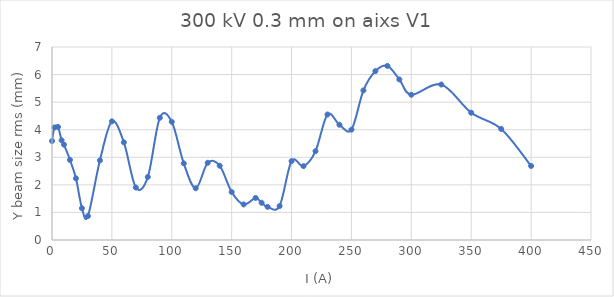
| Category | Series 0 |
|---|---|
| 0.0 | 3.59 |
| 2.0 | 4.081 |
| 5.0 | 4.099 |
| 8.0 | 3.616 |
| 10.0 | 3.458 |
| 15.0 | 2.904 |
| 20.0 | 2.235 |
| 25.0 | 1.153 |
| 30.0 | 0.869 |
| 40.0 | 2.887 |
| 50.0 | 4.302 |
| 60.0 | 3.543 |
| 70.0 | 1.904 |
| 80.0 | 2.285 |
| 90.0 | 4.43 |
| 100.0 | 4.286 |
| 110.0 | 2.779 |
| 120.0 | 1.877 |
| 130.0 | 2.8 |
| 140.0 | 2.694 |
| 150.0 | 1.741 |
| 160.0 | 1.29 |
| 170.0 | 1.526 |
| 175.0 | 1.35 |
| 180.0 | 1.202 |
| 190.0 | 1.232 |
| 200.0 | 2.86 |
| 210.0 | 2.678 |
| 220.0 | 3.221 |
| 230.0 | 4.552 |
| 240.0 | 4.18 |
| 250.0 | 4.002 |
| 260.0 | 5.425 |
| 270.0 | 6.125 |
| 280.0 | 6.314 |
| 290.0 | 5.824 |
| 300.0 | 5.268 |
| 325.0 | 5.639 |
| 350.0 | 4.616 |
| 375.0 | 4.028 |
| 400.0 | 2.684 |